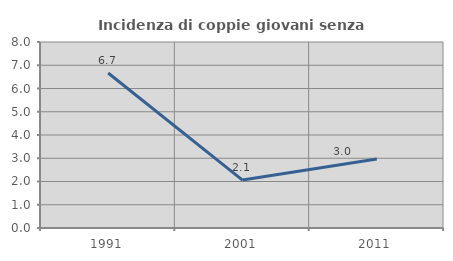
| Category | Incidenza di coppie giovani senza figli |
|---|---|
| 1991.0 | 6.667 |
| 2001.0 | 2.062 |
| 2011.0 | 2.97 |